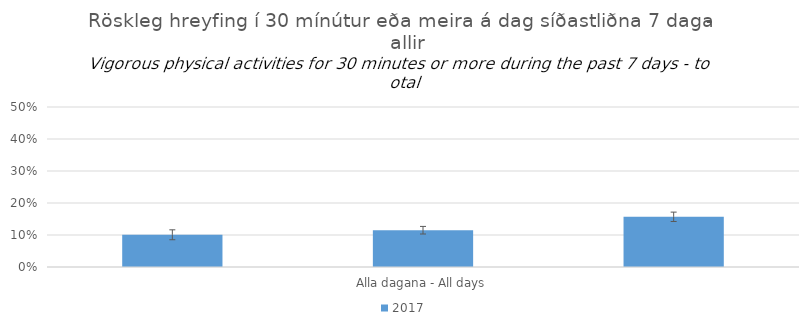
| Category | 2017 |
|---|---|
| 0 | 0.101 |
| 1 | 0.115 |
| 2 | 0.157 |